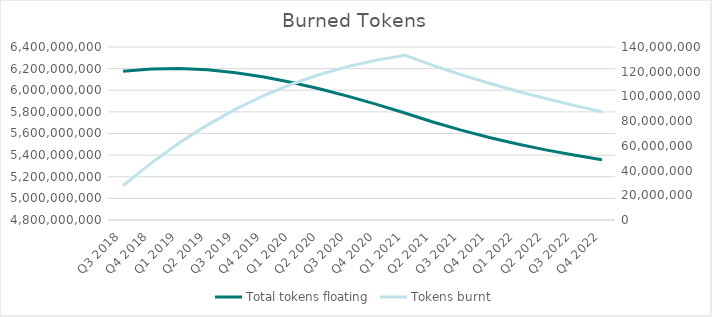
| Category | Total tokens floating |
|---|---|
| Q3 2018 | 6175000000 |
| Q4 2018 | 6197212500 |
| Q1 2019 | 6201176064.286 |
| Q2 2019 | 6188742454.931 |
| Q3 2019 | 6161759069.68 |
| Q4 2019 | 6122032558.168 |
| Q1 2020 | 6071300331.441 |
| Q2 2020 | 6011209235.267 |
| Q3 2020 | 5943300540.037 |
| Q4 2020 | 5869000353.89 |
| Q1 2021 | 5789614573.347 |
| Q2 2021 | 5706327531.367 |
| Q3 2021 | 5631213599.204 |
| Q4 2021 | 5563625957.637 |
| Q1 2022 | 5502981846.424 |
| Q2 2022 | 5448755104.804 |
| Q3 2022 | 5400469690.977 |
| Q4 2022 | 5357694038.867 |